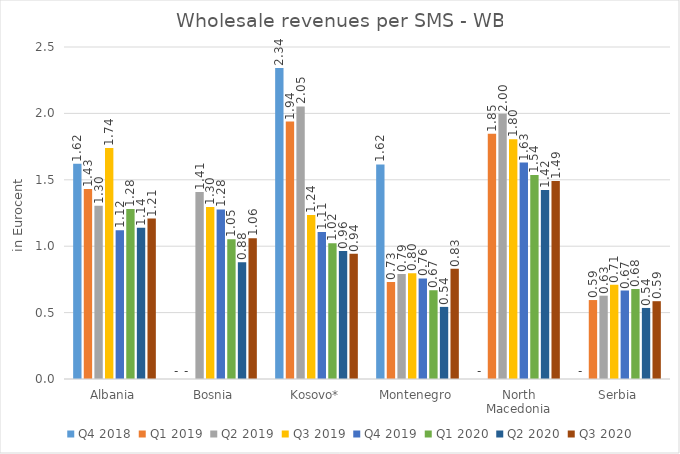
| Category | Q4 2018 | Q1 2019 | Q2 2019 | Q3 2019 | Q4 2019 | Q1 2020 | Q2 2020 | Q3 2020 |
|---|---|---|---|---|---|---|---|---|
| Albania | 1.62 | 1.43 | 1.304 | 1.74 | 1.121 | 1.28 | 1.139 | 1.208 |
| Bosnia | 0 | 0 | 1.409 | 1.295 | 1.277 | 1.051 | 0.879 | 1.06 |
| Kosovo* | 2.342 | 1.938 | 2.052 | 1.235 | 1.108 | 1.021 | 0.965 | 0.943 |
| Montenegro | 1.616 | 0.731 | 0.79 | 0.795 | 0.757 | 0.668 | 0.543 | 0.829 |
| North Macedonia | 0 | 1.846 | 1.997 | 1.805 | 1.629 | 1.536 | 1.423 | 1.491 |
| Serbia | 0 | 0.595 | 0.627 | 0.71 | 0.666 | 0.677 | 0.535 | 0.586 |